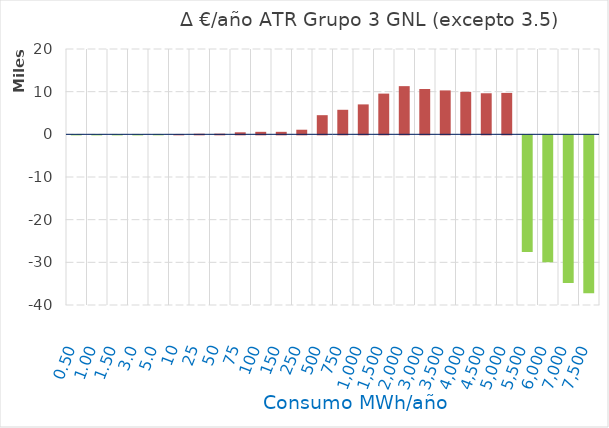
| Category | D €/año |
|---|---|
| 0.5 | -13.581 |
| 1.0 | -14.737 |
| 1.5 | -15.894 |
| 3.0 | -19.363 |
| 5.0 | 8.728 |
| 10.0 | 21.182 |
| 25.0 | 141.585 |
| 50.0 | 158.656 |
| 75.0 | 475.18 |
| 100.0 | 585.615 |
| 150.0 | 585.768 |
| 250.0 | 1080.85 |
| 500.0 | 4489.479 |
| 750.0 | 5753.407 |
| 1000.0 | 7017.335 |
| 1500.0 | 9545.191 |
| 2000.0 | 11294.825 |
| 3000.0 | 10627.887 |
| 3500.0 | 10294.418 |
| 4000.0 | 9960.95 |
| 4500.0 | 9627.481 |
| 5000.0 | 9708.972 |
| 5500.0 | -27327.412 |
| 6000.0 | -29747.947 |
| 7000.0 | -34589.018 |
| 7500.0 | -37009.553 |